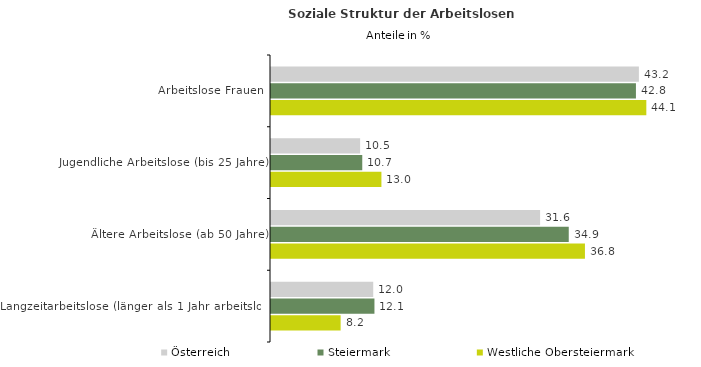
| Category | Österreich | Steiermark | Westliche Obersteiermark |
|---|---|---|---|
| Arbeitslose Frauen | 43.18 | 42.833 | 44.052 |
| Jugendliche Arbeitslose (bis 25 Jahre) | 10.46 | 10.711 | 12.959 |
| Ältere Arbeitslose (ab 50 Jahre) | 31.584 | 34.947 | 36.847 |
| Langzeitarbeitslose (länger als 1 Jahr arbeitslos) | 11.999 | 12.142 | 8.172 |